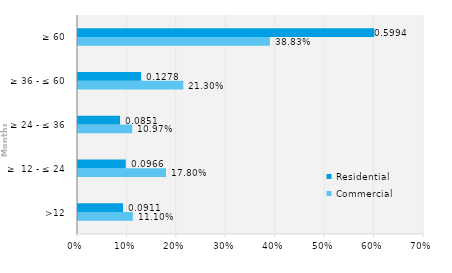
| Category | Commercial | Residential |
|---|---|---|
| >12 | 0.111 | 0.091 |
| ≥  12 - ≤ 24 | 0.178 | 0.097 |
| ≥ 24 - ≤ 36 | 0.11 | 0.085 |
| ≥ 36 - ≤ 60 | 0.213 | 0.128 |
| ≥ 60 | 0.388 | 0.599 |